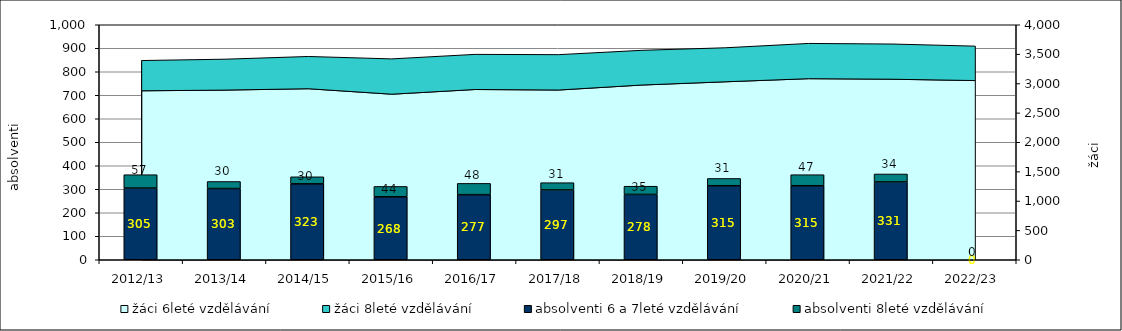
| Category | absolventi 6 a 7leté vzdělávání | absolventi 8leté vzdělávání |
|---|---|---|
| 2012/13 | 305 | 57 |
| 2013/14 | 303 | 30 |
| 2014/15 | 323 | 30 |
| 2015/16 | 268 | 44 |
| 2016/17 | 277 | 48 |
| 2017/18 | 297 | 31 |
| 2018/19 | 278 | 35 |
| 2019/20 | 315 | 31 |
| 2020/21 | 315 | 47 |
| 2021/22 | 331 | 34 |
| 2022/23 | 0 | 0 |